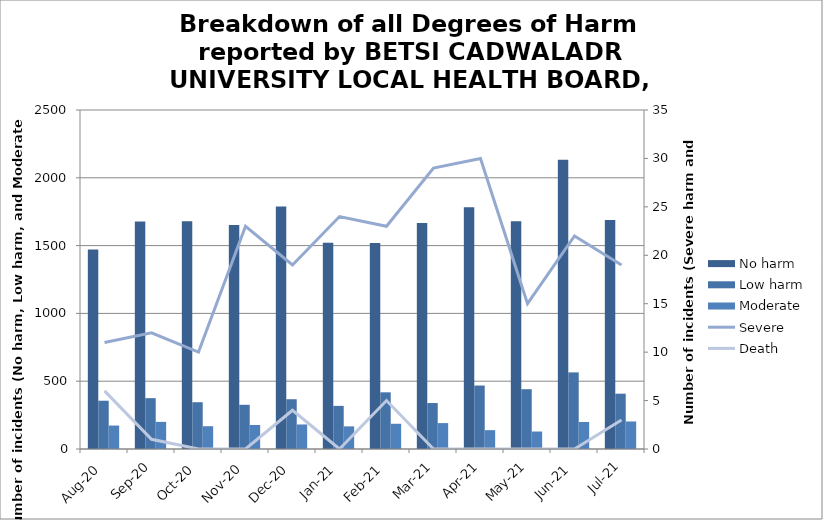
| Category | No harm | Low harm | Moderate |
|---|---|---|---|
| Aug-20 | 1471 | 356 | 173 |
| Sep-20 | 1677 | 375 | 200 |
| Oct-20 | 1679 | 345 | 168 |
| Nov-20 | 1652 | 326 | 177 |
| Dec-20 | 1789 | 367 | 181 |
| Jan-21 | 1521 | 318 | 167 |
| Feb-21 | 1520 | 418 | 186 |
| Mar-21 | 1667 | 339 | 191 |
| Apr-21 | 1783 | 468 | 139 |
| May-21 | 1680 | 441 | 129 |
| Jun-21 | 2134 | 565 | 199 |
| Jul-21 | 1689 | 408 | 203 |